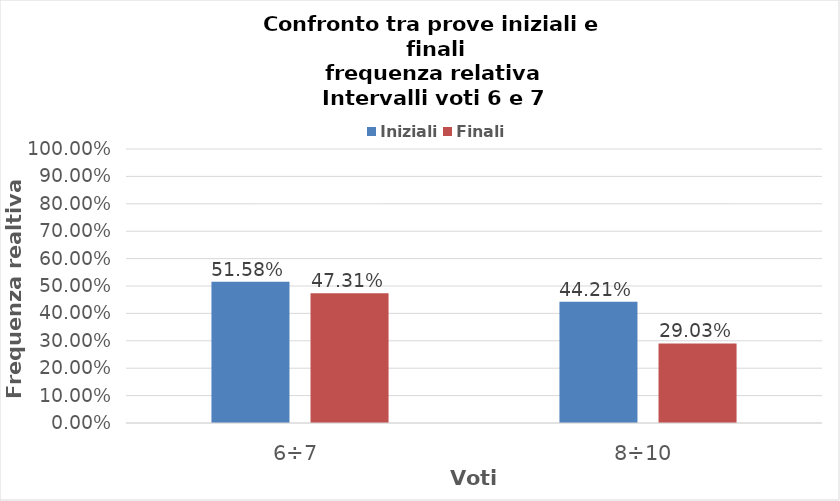
| Category | Iniziali | Finali |
|---|---|---|
| 6÷7 | 0.516 | 0.473 |
| 8÷10 | 0.442 | 0.29 |